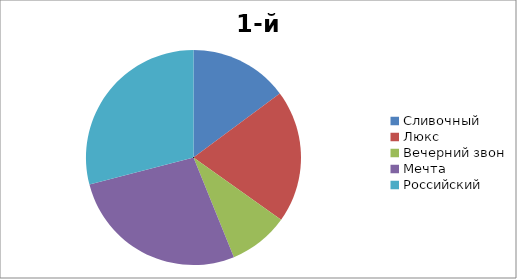
| Category | 1-й квартал |
|---|---|
| Сливочный | 23 |
| Люкс | 31 |
| Вечерний звон | 14 |
| Мечта | 42 |
| Российский | 45 |